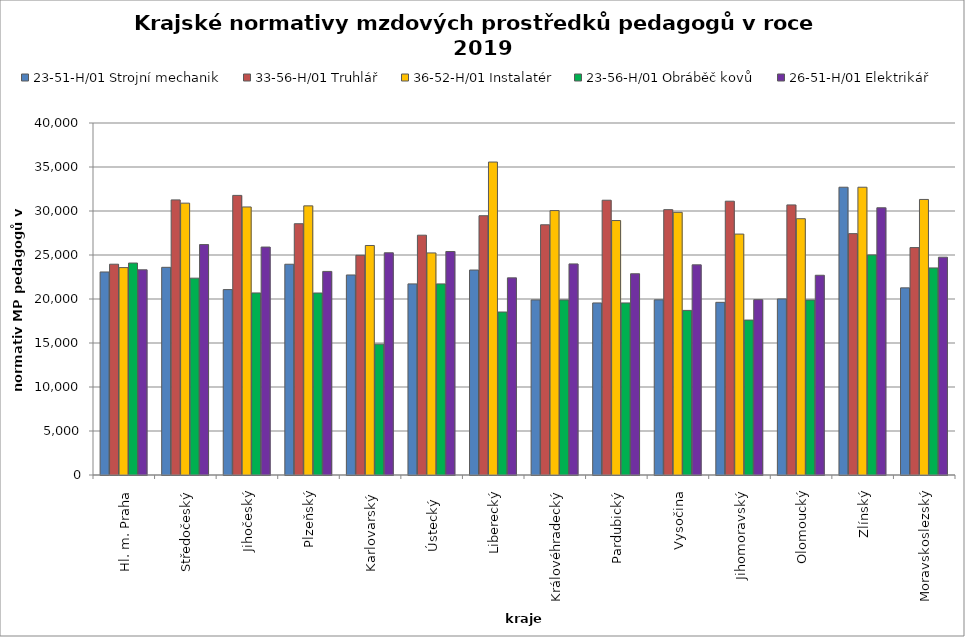
| Category | 23-51-H/01 Strojní mechanik | 33-56-H/01 Truhlář | 36-52-H/01 Instalatér | 23-56-H/01 Obráběč kovů | 26-51-H/01 Elektrikář |
|---|---|---|---|---|---|
| Hl. m. Praha | 23071.579 | 23954.098 | 23567.742 | 24085.714 | 23317.021 |
| Středočeský | 23599.938 | 31261.21 | 30891.604 | 22368.55 | 26185.174 |
| Jihočeský | 21068.481 | 31772.132 | 30458.498 | 20687.423 | 25902.429 |
| Plzeňský | 23949.58 | 28553.538 | 30583.501 | 20680.272 | 23135.464 |
| Karlovarský  | 22730.707 | 24967.398 | 26080.495 | 14867.631 | 25251.799 |
| Ústecký   | 21715.551 | 27250 | 25234.727 | 21715.551 | 25398.058 |
| Liberecký | 23291.161 | 29463.255 | 35564.246 | 18521.113 | 22401.686 |
| Královéhradecký | 19895.301 | 28433.311 | 30047.693 | 19895.301 | 23987.082 |
| Pardubický | 19551.592 | 31224.413 | 28916.522 | 19551.592 | 22868.08 |
| Vysočina | 19905.068 | 30153.405 | 29847.724 | 18704.22 | 23882.92 |
| Jihomoravský | 19621.725 | 31113.77 | 27377.944 | 17606.073 | 19924.423 |
| Olomoucký | 20006.75 | 30691.553 | 29124.24 | 19883.142 | 22697.834 |
| Zlínský | 32701.846 | 27427.355 | 32701.846 | 25007.294 | 30366 |
| Moravskoslezský | 21264.279 | 25842.353 | 31312.901 | 23530.798 | 24750.423 |